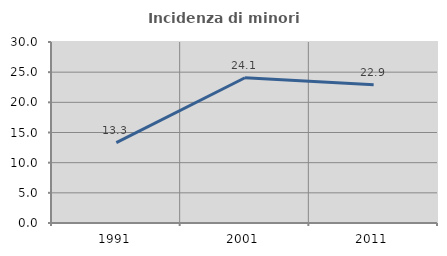
| Category | Incidenza di minori stranieri |
|---|---|
| 1991.0 | 13.333 |
| 2001.0 | 24.074 |
| 2011.0 | 22.908 |